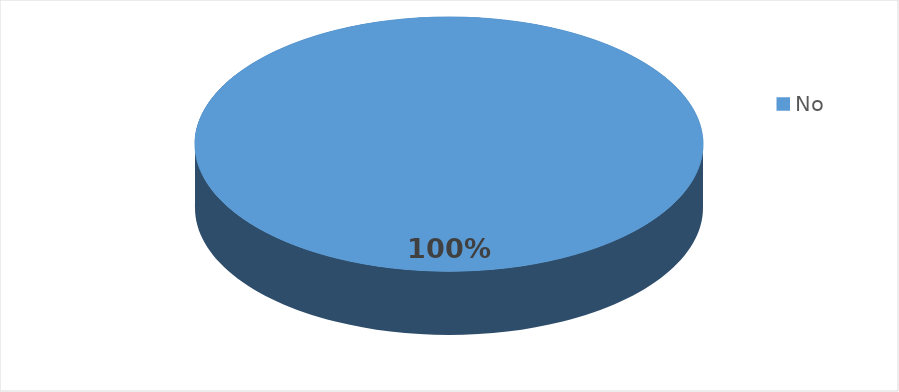
| Category | Frecuencia |
|---|---|
| No | 21 |